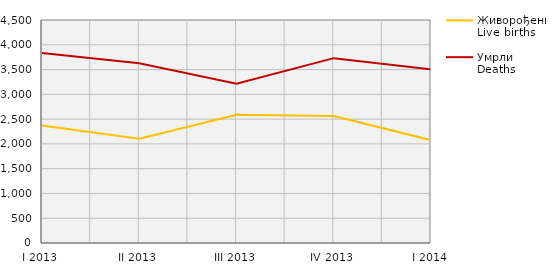
| Category | Живорођени
Live births | Умрли
Deaths |
|---|---|---|
| I 2013 | 2369 | 3833 |
| II 2013 | 2102 | 3626 |
| III 2013 | 2587 | 3214 |
| IV 2013 | 2561 | 3730 |
| I 2014 | 2076 | 3505 |